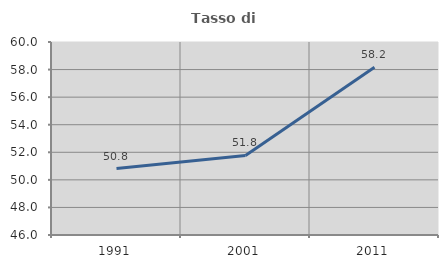
| Category | Tasso di occupazione   |
|---|---|
| 1991.0 | 50.82 |
| 2001.0 | 51.775 |
| 2011.0 | 58.161 |